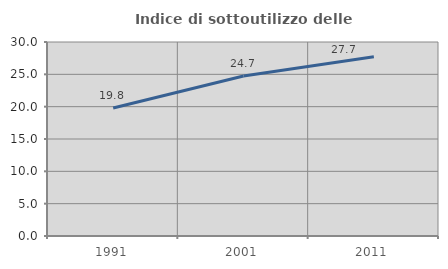
| Category | Indice di sottoutilizzo delle abitazioni  |
|---|---|
| 1991.0 | 19.795 |
| 2001.0 | 24.735 |
| 2011.0 | 27.715 |